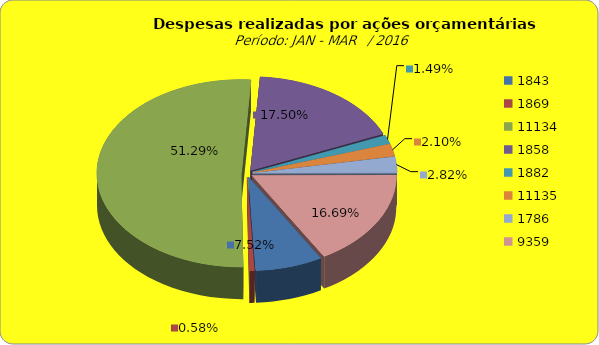
| Category | Series 1 |
|---|---|
| 1843.0 | 5477261.89 |
| 1869.0 | 425799.41 |
| 11134.0 | 37370566.76 |
| 1858.0 | 12750471.13 |
| 1882.0 | 1084171.5 |
| 11135.0 | 1531977.79 |
| 1786.0 | 2052692.78 |
| 9359.0 | 12161784.56 |